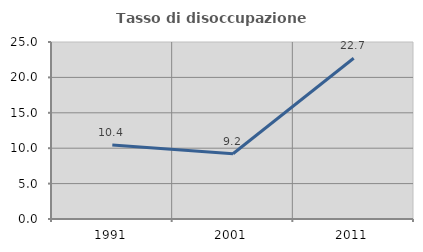
| Category | Tasso di disoccupazione giovanile  |
|---|---|
| 1991.0 | 10.445 |
| 2001.0 | 9.214 |
| 2011.0 | 22.709 |